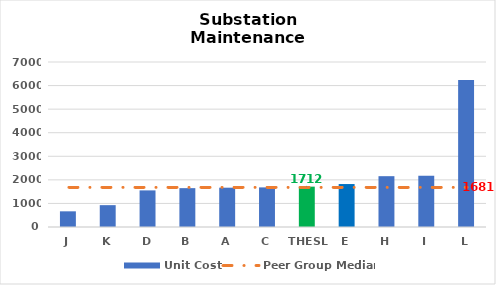
| Category | Unit Cost |
|---|---|
| J | 665 |
| K | 927 |
| D | 1552.77 |
| B | 1648.62 |
| A | 1667.79 |
| C | 1680.57 |
| THESL | 1712.471 |
| E | 1822.428 |
| H | 2155.986 |
| I | 2175.156 |
| L | 6232 |